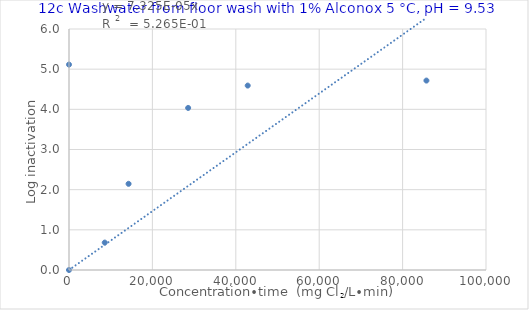
| Category | Series 0 |
|---|---|
| 0.0 | 0 |
| 8571.428571428572 | 0.683 |
| 14285.714285714286 | 2.145 |
| 28571.428571428572 | 4.035 |
| 42857.14285714286 | 4.591 |
| 85714.28571428572 | 4.716 |